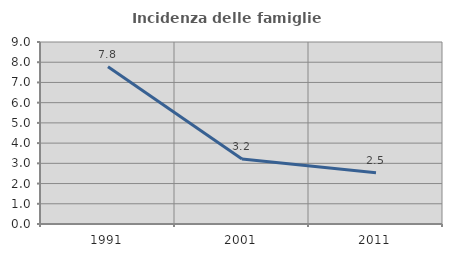
| Category | Incidenza delle famiglie numerose |
|---|---|
| 1991.0 | 7.773 |
| 2001.0 | 3.209 |
| 2011.0 | 2.54 |